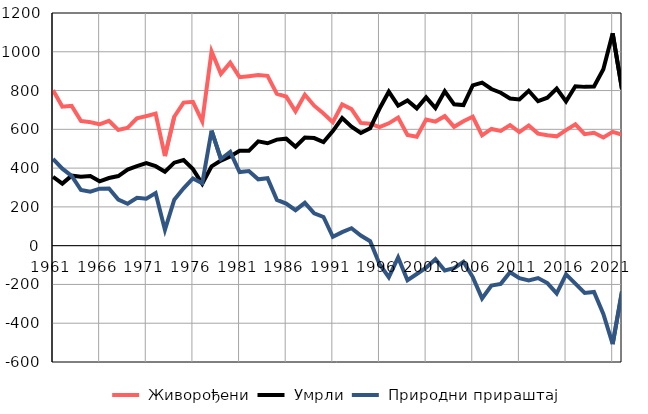
| Category |  Живорођени |  Умрли |  Природни прираштај |
|---|---|---|---|
| 1961.0 | 802 | 355 | 447 |
| 1962.0 | 717 | 320 | 397 |
| 1963.0 | 721 | 361 | 360 |
| 1964.0 | 643 | 356 | 287 |
| 1965.0 | 637 | 359 | 278 |
| 1966.0 | 626 | 332 | 294 |
| 1967.0 | 644 | 349 | 295 |
| 1968.0 | 597 | 359 | 238 |
| 1969.0 | 608 | 392 | 216 |
| 1970.0 | 657 | 410 | 247 |
| 1971.0 | 668 | 426 | 242 |
| 1972.0 | 681 | 410 | 271 |
| 1973.0 | 462 | 381 | 81 |
| 1974.0 | 665 | 428 | 237 |
| 1975.0 | 738 | 442 | 296 |
| 1976.0 | 742 | 395 | 347 |
| 1977.0 | 641 | 319 | 322 |
| 1978.0 | 1002 | 409 | 593 |
| 1979.0 | 886 | 439 | 447 |
| 1980.0 | 944 | 460 | 484 |
| 1981.0 | 869 | 489 | 380 |
| 1982.0 | 874 | 489 | 385 |
| 1983.0 | 880 | 538 | 342 |
| 1984.0 | 876 | 528 | 348 |
| 1985.0 | 783 | 547 | 236 |
| 1986.0 | 769 | 552 | 217 |
| 1987.0 | 693 | 510 | 183 |
| 1988.0 | 779 | 558 | 221 |
| 1989.0 | 722 | 555 | 167 |
| 1990.0 | 682 | 534 | 148 |
| 1991.0 | 637 | 591 | 46 |
| 1992.0 | 728 | 658 | 70 |
| 1993.0 | 704 | 614 | 90 |
| 1994.0 | 633 | 581 | 52 |
| 1995.0 | 629 | 606 | 23 |
| 1996.0 | 611 | 706 | -95 |
| 1997.0 | 631 | 794 | -163 |
| 1998.0 | 661 | 722 | -61 |
| 1999.0 | 571 | 749 | -178 |
| 2000.0 | 562 | 708 | -146 |
| 2001.0 | 651 | 765 | -114 |
| 2002.0 | 640 | 710 | -70 |
| 2003.0 | 668 | 796 | -128 |
| 2004.0 | 613 | 729 | -116 |
| 2005.0 | 642 | 725 | -83 |
| 2006.0 | 665 | 827 | -162 |
| 2007.0 | 569 | 841 | -272 |
| 2008.0 | 602 | 808 | -206 |
| 2009.0 | 592 | 789 | -197 |
| 2010.0 | 622 | 759 | -137 |
| 2011.0 | 586 | 754 | -168 |
| 2012.0 | 620 | 799 | -179 |
| 2013.0 | 578 | 745 | -167 |
| 2014.0 | 570 | 763 | -193 |
| 2015.0 | 564 | 810 | -246 |
| 2016.0 | 596 | 744 | -148 |
| 2017.0 | 626 | 822 | -196 |
| 2018.0 | 575 | 819 | -244 |
| 2019.0 | 582 | 821 | -239 |
| 2020.0 | 558 | 910 | -352 |
| 2021.0 | 587 | 1095 | -508 |
| 2022.0 | 572 | 807 | -235 |